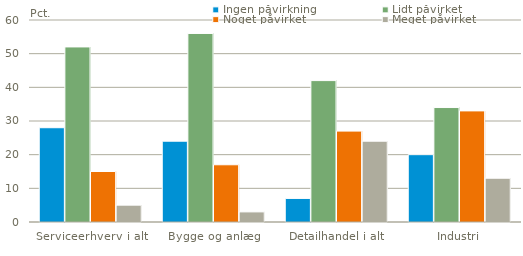
| Category | Ingen påvirkning | Lidt påvirket | Noget påvirket | Meget påvirket |
|---|---|---|---|---|
| Serviceerhverv i alt | 28 | 52 | 15 | 5 |
| Bygge og anlæg | 24 | 56 | 17 | 3 |
| Detailhandel i alt | 7 | 42 | 27 | 24 |
| Industri | 20 | 34 | 33 | 13 |